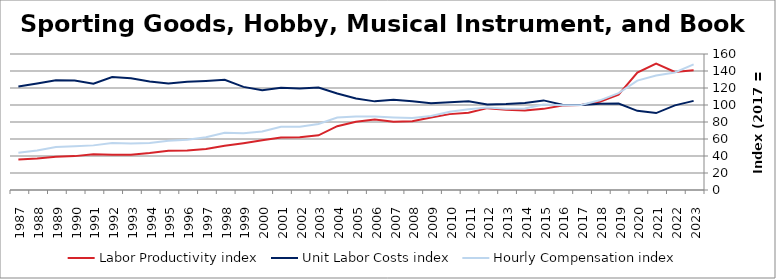
| Category | Labor Productivity index | Unit Labor Costs index | Hourly Compensation index |
|---|---|---|---|
| 2023.0 | 140.928 | 104.878 | 147.803 |
| 2022.0 | 138.916 | 99.575 | 138.326 |
| 2021.0 | 148.703 | 90.519 | 134.604 |
| 2020.0 | 138.211 | 93.11 | 128.689 |
| 2019.0 | 112.09 | 101.642 | 113.931 |
| 2018.0 | 103.85 | 101.579 | 105.49 |
| 2017.0 | 100 | 100 | 100 |
| 2016.0 | 99.363 | 100.24 | 99.601 |
| 2015.0 | 95.45 | 105.416 | 100.62 |
| 2014.0 | 93.461 | 102.465 | 95.765 |
| 2013.0 | 94.494 | 101.193 | 95.621 |
| 2012.0 | 96.307 | 100.678 | 96.96 |
| 2011.0 | 90.969 | 104.399 | 94.97 |
| 2010.0 | 89.268 | 103.247 | 92.167 |
| 2009.0 | 85.304 | 102.012 | 87.02 |
| 2008.0 | 81.015 | 104.483 | 84.648 |
| 2007.0 | 80.375 | 106.131 | 85.303 |
| 2006.0 | 82.898 | 104.278 | 86.445 |
| 2005.0 | 80.201 | 107.681 | 86.361 |
| 2004.0 | 75.042 | 113.579 | 85.233 |
| 2003.0 | 64.33 | 120.659 | 77.62 |
| 2002.0 | 62.189 | 119.501 | 74.317 |
| 2001.0 | 61.815 | 120.272 | 74.346 |
| 2000.0 | 58.531 | 117.494 | 68.77 |
| 1999.0 | 55.025 | 121.297 | 66.744 |
| 1998.0 | 51.927 | 129.706 | 67.352 |
| 1997.0 | 48.32 | 128.306 | 61.998 |
| 1996.0 | 46.519 | 127.311 | 59.224 |
| 1995.0 | 46.134 | 125.333 | 57.821 |
| 1994.0 | 43.417 | 127.542 | 55.374 |
| 1993.0 | 41.553 | 131.391 | 54.597 |
| 1992.0 | 41.58 | 132.923 | 55.269 |
| 1991.0 | 41.961 | 125.119 | 52.501 |
| 1990.0 | 39.854 | 128.896 | 51.37 |
| 1989.0 | 39.087 | 129.1 | 50.461 |
| 1988.0 | 37.166 | 125.195 | 46.529 |
| 1987.0 | 35.956 | 121.768 | 43.783 |